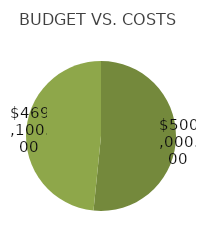
| Category | Series 0 |
|---|---|
| 0 | 500000 |
| 1 | 469100 |